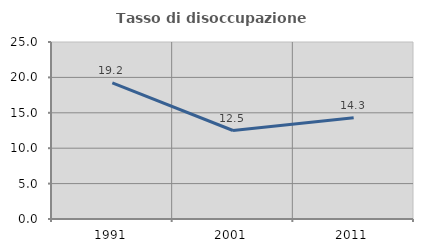
| Category | Tasso di disoccupazione giovanile  |
|---|---|
| 1991.0 | 19.231 |
| 2001.0 | 12.5 |
| 2011.0 | 14.286 |